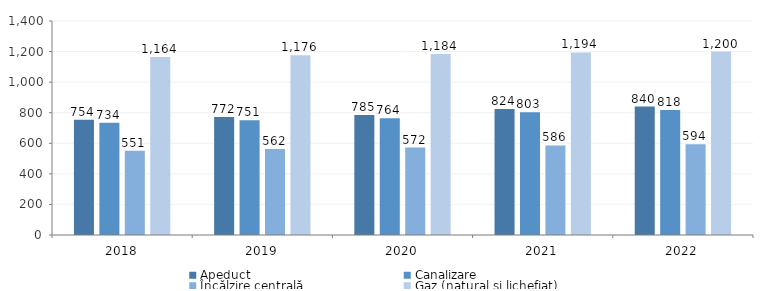
| Category | Apeduct | Canalizare | Încălzire centrală | Gaz (natural şi lichefiat) |
|---|---|---|---|---|
| 2018.0 | 754.463 | 733.989 | 550.751 | 1164.38 |
| 2019.0 | 771.768 | 750.924 | 562.472 | 1175.769 |
| 2020.0 | 785 | 764 | 572 | 1184.356 |
| 2021.0 | 824 | 803 | 586 | 1194 |
| 2022.0 | 840 | 818 | 594 | 1200 |